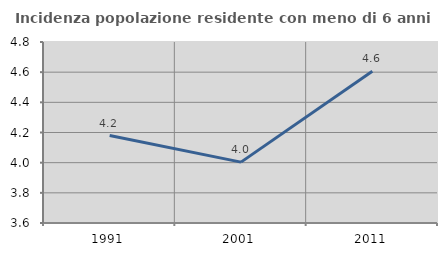
| Category | Incidenza popolazione residente con meno di 6 anni |
|---|---|
| 1991.0 | 4.18 |
| 2001.0 | 4.004 |
| 2011.0 | 4.606 |